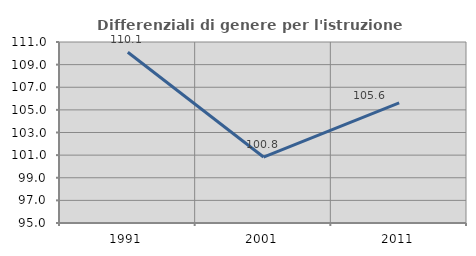
| Category | Differenziali di genere per l'istruzione superiore |
|---|---|
| 1991.0 | 110.095 |
| 2001.0 | 100.831 |
| 2011.0 | 105.616 |